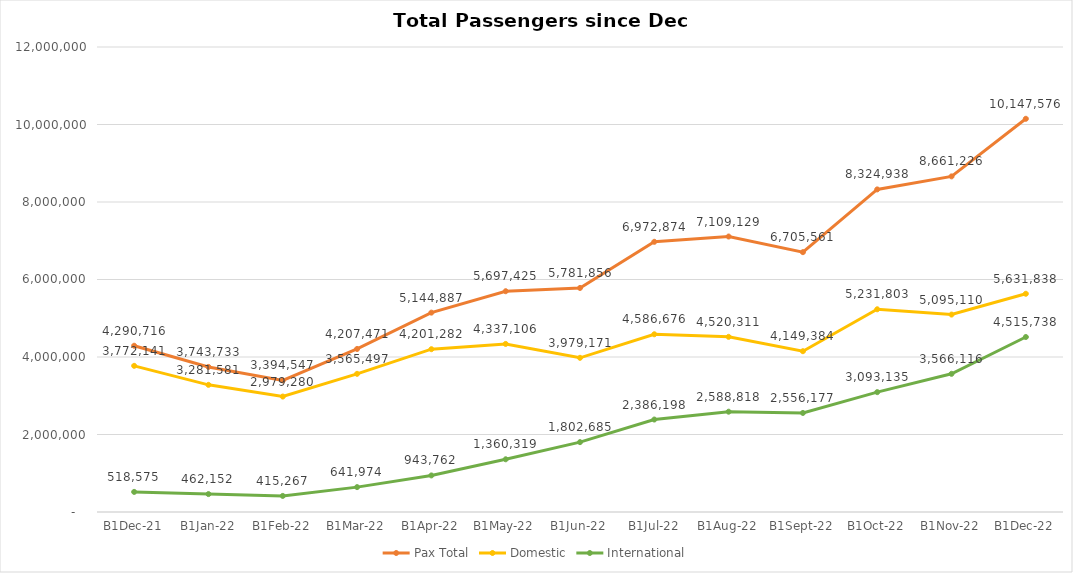
| Category | Pax Total |  Domestic  |  International  |
|---|---|---|---|
| 2021-12-01 | 4290716 | 3772141 | 518575 |
| 2022-01-01 | 3743733 | 3281581 | 462152 |
| 2022-02-01 | 3394547 | 2979280 | 415267 |
| 2022-03-01 | 4207471 | 3565497 | 641974 |
| 2022-04-01 | 5144887 | 4201282 | 943762 |
| 2022-05-01 | 5697425 | 4337106 | 1360319 |
| 2022-06-01 | 5781856 | 3979171 | 1802685 |
| 2022-07-01 | 6972874 | 4586676 | 2386198 |
| 2022-08-01 | 7109129 | 4520311 | 2588818 |
| 2022-09-01 | 6705561 | 4149384 | 2556177 |
| 2022-10-01 | 8324938 | 5231803 | 3093135 |
| 2022-11-01 | 8661226 | 5095110 | 3566116 |
| 2022-12-01 | 10147576 | 5631838 | 4515738 |